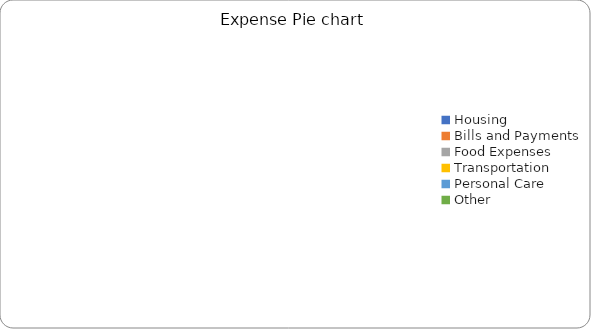
| Category | Series 0 |
|---|---|
| Housing | 0 |
| Bills and Payments | 0 |
| Food Expenses | 0 |
| Transportation | 0 |
| Personal Care | 0 |
| Other | 0 |